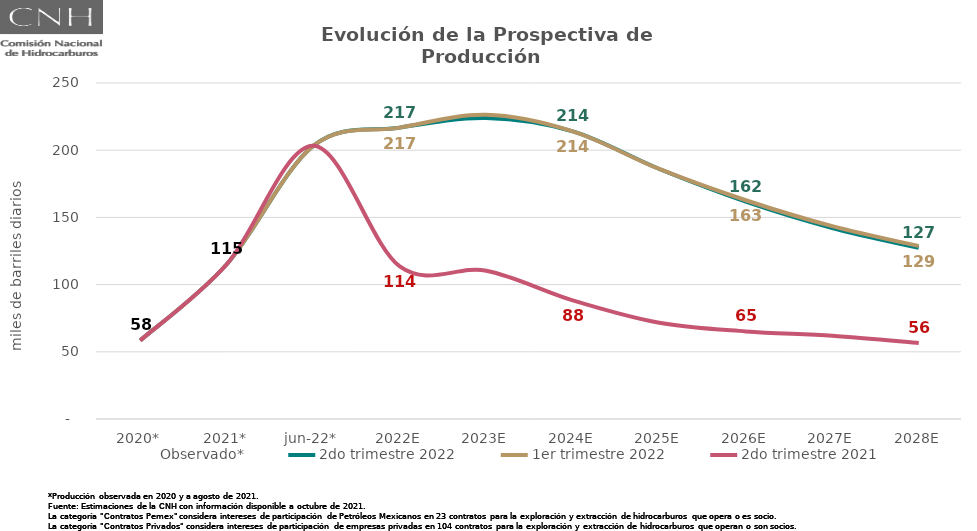
| Category | Observado* | 2do trimestre 2022 | 1er trimestre 2022 | 2do trimestre 2021 |
|---|---|---|---|---|
| 2020* | 58.421 | 58.421 | 58.421 | 58.421 |
| 2021* | 115.166 | 115.166 | 115.166 | 115.166 |
| jun-22* | 203.259 | 203.259 | 203.259 | 203.259 |
| 2022E | 216.81 | 216.81 | 216.81 | 113.542 |
| 2023E | 223.922 | 223.922 | 226.306 | 110.319 |
| 2024E | 214.023 | 214.023 | 214.023 | 88.312 |
| 2025E | 186.027 | 186.027 | 186.027 | 71.63 |
| 2026E | 161.721 | 161.721 | 162.772 | 65.162 |
| 2027E | 142.105 | 142.105 | 143.464 | 61.983 |
| 2028E | 127.344 | 127.344 | 128.656 | 56.483 |